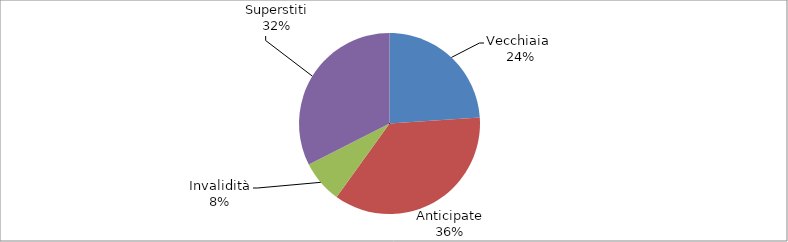
| Category | Series 0 |
|---|---|
| Vecchiaia  | 62479 |
| Anticipate | 93799 |
| Invalidità | 19774 |
| Superstiti | 84654 |